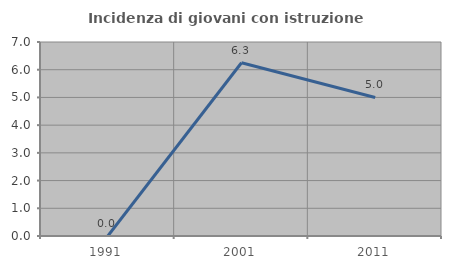
| Category | Incidenza di giovani con istruzione universitaria |
|---|---|
| 1991.0 | 0 |
| 2001.0 | 6.25 |
| 2011.0 | 5 |